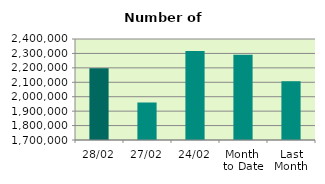
| Category | Series 0 |
|---|---|
| 28/02 | 2196696 |
| 27/02 | 1959936 |
| 24/02 | 2316972 |
| Month 
to Date | 2290810.7 |
| Last
Month | 2107310.455 |